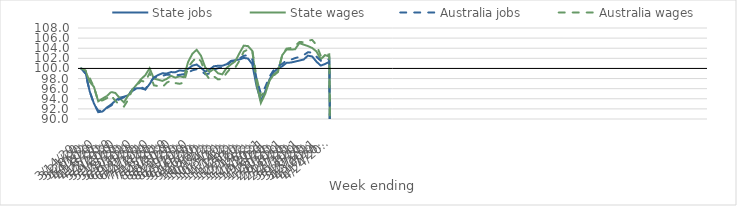
| Category | State jobs | State wages | Australia jobs | Australia wages |
|---|---|---|---|---|
| 14/03/2020 | 100 | 100 | 100 | 100 |
| 21/03/2020 | 99.322 | 99.569 | 98.971 | 99.607 |
| 28/03/2020 | 95.462 | 97.372 | 95.468 | 98.119 |
| 04/04/2020 | 93.057 | 96.34 | 92.921 | 96.261 |
| 11/04/2020 | 91.35 | 93.499 | 91.648 | 93.491 |
| 18/04/2020 | 91.481 | 94.044 | 91.631 | 93.695 |
| 25/04/2020 | 92.265 | 94.534 | 92.161 | 94.112 |
| 02/05/2020 | 92.857 | 95.338 | 92.658 | 94.685 |
| 09/05/2020 | 93.613 | 95.156 | 93.342 | 93.574 |
| 16/05/2020 | 94.226 | 94.144 | 93.935 | 92.809 |
| 23/05/2020 | 94.406 | 93.272 | 94.29 | 92.465 |
| 30/05/2020 | 94.684 | 94.681 | 94.796 | 93.818 |
| 06/06/2020 | 95.539 | 95.815 | 95.779 | 95.924 |
| 13/06/2020 | 96.093 | 96.819 | 96.278 | 96.597 |
| 20/06/2020 | 96.069 | 97.889 | 96.293 | 97.571 |
| 27/06/2020 | 95.821 | 98.667 | 95.898 | 97.324 |
| 04/07/2020 | 96.905 | 100.027 | 97.132 | 99.089 |
| 11/07/2020 | 98.223 | 97.991 | 98.221 | 96.668 |
| 18/07/2020 | 98.696 | 97.775 | 98.324 | 96.5 |
| 25/07/2020 | 99.047 | 97.538 | 98.548 | 96.312 |
| 01/08/2020 | 98.99 | 97.937 | 98.77 | 97.181 |
| 08/08/2020 | 99.279 | 98.532 | 98.766 | 97.601 |
| 15/08/2020 | 99.246 | 98.184 | 98.672 | 97.108 |
| 22/08/2020 | 99.613 | 98.444 | 98.73 | 96.964 |
| 29/08/2020 | 99.515 | 98.262 | 98.866 | 97.198 |
| 05/09/2020 | 99.922 | 101.286 | 99.166 | 100.215 |
| 12/09/2020 | 100.557 | 102.908 | 99.638 | 101.349 |
| 19/09/2020 | 100.776 | 103.689 | 99.835 | 102.253 |
| 26/09/2020 | 100.119 | 102.526 | 99.64 | 101.42 |
| 03/10/2020 | 99.385 | 100.217 | 98.855 | 99.138 |
| 10/10/2020 | 99.772 | 99.299 | 98.997 | 97.834 |
| 17/10/2020 | 100.427 | 99.898 | 99.767 | 98.431 |
| 24/10/2020 | 100.53 | 99.036 | 100.05 | 97.835 |
| 31/10/2020 | 100.543 | 98.833 | 100.228 | 97.89 |
| 07/11/2020 | 100.828 | 100.099 | 100.597 | 99.112 |
| 14/11/2020 | 101.485 | 100.789 | 101.334 | 100.12 |
| 21/11/2020 | 101.639 | 101.396 | 101.652 | 100.166 |
| 28/11/2020 | 101.765 | 103.024 | 101.968 | 101.522 |
| 05/12/2020 | 102.077 | 104.512 | 102.515 | 103.324 |
| 12/12/2020 | 101.967 | 104.42 | 102.583 | 103.755 |
| 19/12/2020 | 100.83 | 103.473 | 101.771 | 103.629 |
| 26/12/2020 | 96.484 | 97.023 | 97.972 | 98.159 |
| 02/01/2021 | 93.598 | 93.176 | 95.021 | 94.58 |
| 09/01/2021 | 95.402 | 94.946 | 96.246 | 95.443 |
| 16/01/2021 | 97.789 | 97.547 | 98.354 | 97.531 |
| 23/01/2021 | 99.28 | 98.79 | 99.666 | 98.597 |
| 30/01/2021 | 100.014 | 99.422 | 100.48 | 99.293 |
| 06/02/2021 | 100.427 | 102.633 | 100.907 | 102.696 |
| 13/02/2021 | 101.109 | 103.737 | 101.592 | 103.915 |
| 20/02/2021 | 101.165 | 103.723 | 101.718 | 104.04 |
| 27/02/2021 | 101.356 | 103.799 | 102.048 | 104.48 |
| 06/03/2021 | 101.561 | 105.006 | 102.273 | 105.217 |
| 13/03/2021 | 101.76 | 104.718 | 102.625 | 105.198 |
| 20/03/2021 | 102.533 | 104.422 | 103.203 | 105.516 |
| 27/03/2021 | 102.367 | 104.048 | 103.136 | 105.634 |
| 03/04/2021 | 101.337 | 103.359 | 102.34 | 104.641 |
| 10/04/2021 | 100.565 | 101.812 | 101.508 | 102.484 |
| 17/04/2021 | 100.876 | 102.636 | 101.424 | 102.692 |
| 24/04/2021 | 101.294 | 102.374 | 101.89 | 102.787 |